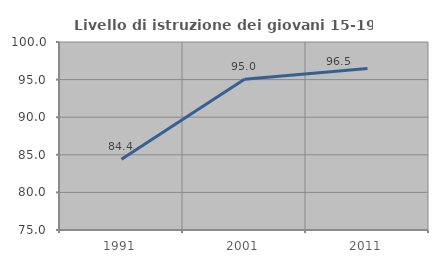
| Category | Livello di istruzione dei giovani 15-19 anni |
|---|---|
| 1991.0 | 84.417 |
| 2001.0 | 95.041 |
| 2011.0 | 96.469 |